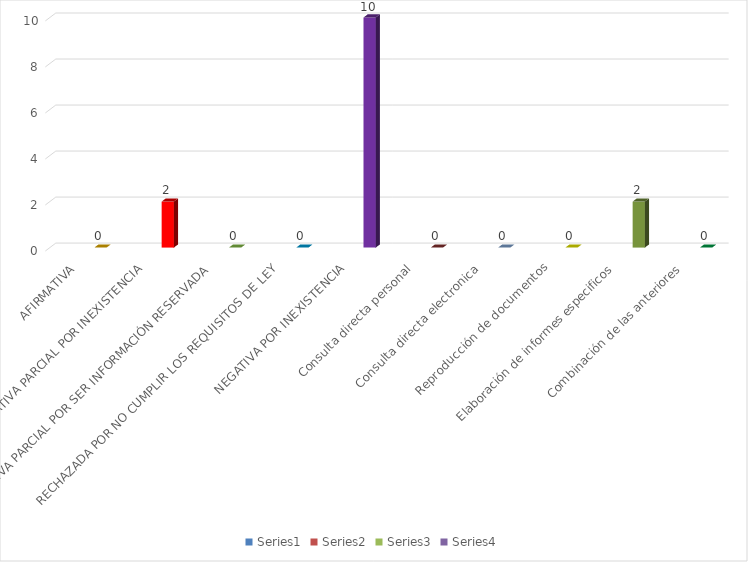
| Category | Series 0 | Series 1 | Series 2 | Series 3 |
|---|---|---|---|---|
| AFIRMATIVA |  |  |  | 0 |
| AFIRMATIVA PARCIAL POR INEXISTENCIA |  |  |  | 2 |
| AFIRMATIVA PARCIAL POR SER INFORMACIÓN RESERVADA |  |  |  | 0 |
| RECHAZADA POR NO CUMPLIR LOS REQUISITOS DE LEY |  |  |  | 0 |
| NEGATIVA POR INEXISTENCIA |  |  |  | 10 |
| Consulta directa personal |  |  |  | 0 |
| Consulta directa electronica |  |  |  | 0 |
| Reproducción de documentos |  |  |  | 0 |
| Elaboración de informes especificos |  |  |  | 2 |
| Combinación de las anteriores |  |  |  | 0 |